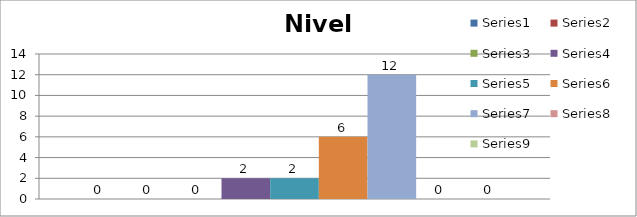
| Category | Series 0 | Series 1 | Series 2 | Series 3 | Series 4 | Series 5 | Series 6 | Series 7 | Series 8 |
|---|---|---|---|---|---|---|---|---|---|
| 0 | 0 | 0 | 0 | 2 | 2 | 6 | 12 | 0 | 0 |